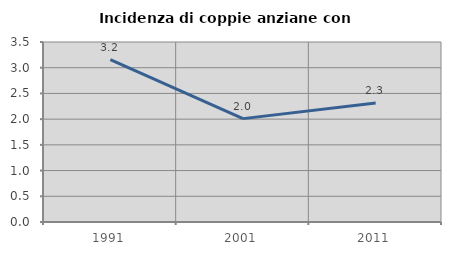
| Category | Incidenza di coppie anziane con figli |
|---|---|
| 1991.0 | 3.158 |
| 2001.0 | 2.01 |
| 2011.0 | 2.312 |